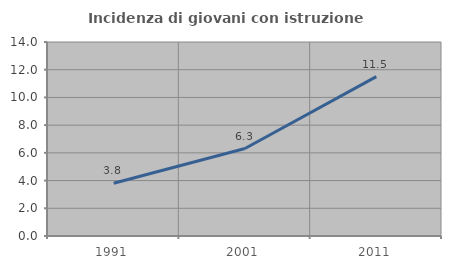
| Category | Incidenza di giovani con istruzione universitaria |
|---|---|
| 1991.0 | 3.808 |
| 2001.0 | 6.312 |
| 2011.0 | 11.506 |